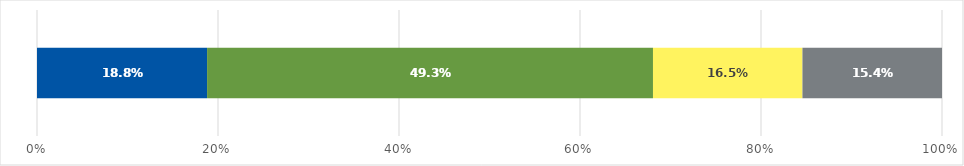
| Category | Renewable | Reciprocating Engine | Gas Turbine | Microturbine |
|---|---|---|---|---|
| 0 | 1.487 | 3.899 | 1.307 | 1.22 |